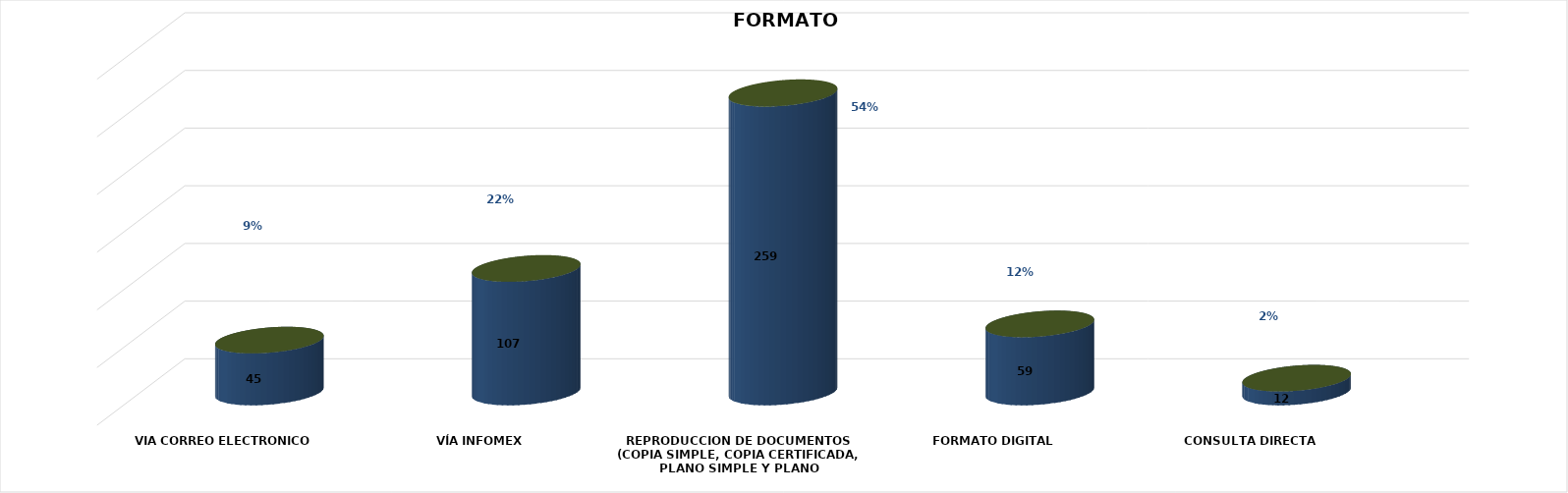
| Category | Series 0 | Series 1 | Series 2 | Series 3 | Series 4 |
|---|---|---|---|---|---|
| VIA CORREO ELECTRONICO |  |  |  | 45 | 0.093 |
| VÍA INFOMEX |  |  |  | 107 | 0.222 |
| REPRODUCCION DE DOCUMENTOS (COPIA SIMPLE, COPIA CERTIFICADA, PLANO SIMPLE Y PLANO CERTIFICADO) |  |  |  | 259 | 0.537 |
| FORMATO DIGITAL |  |  |  | 59 | 0.122 |
| CONSULTA DIRECTA |  |  |  | 12 | 0.025 |